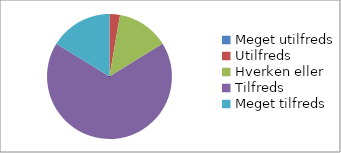
| Category | Hvor tilfreds er du med arrangementets praktiske afvikling - invitation og information? (n=37) |
|---|---|
| Meget utilfreds | 0 |
| Utilfreds | 0.027 |
| Hverken eller | 0.135 |
| Tilfreds | 0.676 |
| Meget tilfreds | 0.162 |